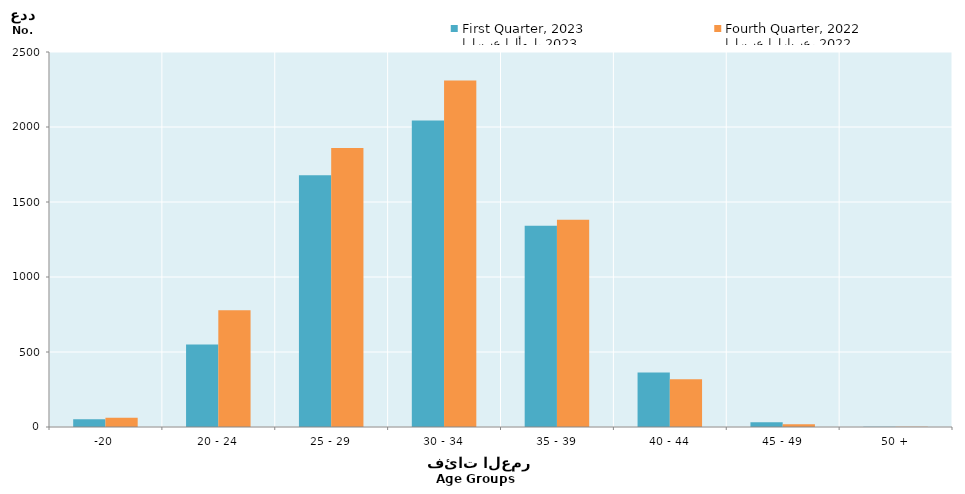
| Category | الربع الأول، 2023
First Quarter, 2023 | الربع الرابع، 2022
Fourth Quarter, 2022 |
|---|---|---|
| -20 | 52 | 61 |
| 20 - 24 | 550 | 779 |
| 25 - 29 | 1678 | 1860 |
| 30 - 34 | 2044 | 2310 |
| 35 - 39 | 1342 | 1381 |
| 40 - 44 | 364 | 319 |
| 45 - 49 | 31 | 18 |
| 50 + | 2 | 1 |